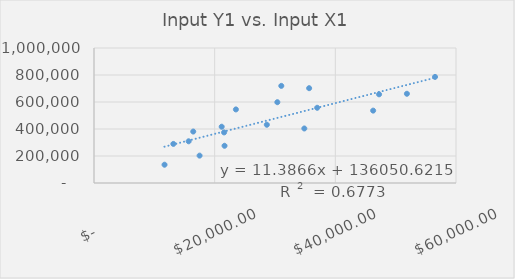
| Category | Input X1 |
|---|---|
| 11690.0 | 135437 |
| 17500.0 | 202750 |
| 47250.0 | 656910 |
| 30388.235294117647 | 598518 |
| 56525.0 | 785859 |
| 21560.0 | 374682 |
| 31045.0 | 719357 |
| 16450.0 | 381170 |
| 34860.0 | 403878 |
| 21636.363636363636 | 275740 |
| 36992.307692307695 | 557157 |
| 21164.70588235294 | 416854 |
| 23520.0 | 544992 |
| 15688.235294117647 | 308991 |
| 51863.63636363637 | 660965 |
| 35658.82352941176 | 702326 |
| 46269.99999999999 | 536071 |
| 13152.631578947368 | 289527 |
| 28646.153846153844 | 431452 |